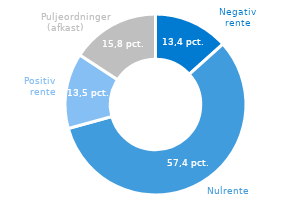
| Category | Series 0 |
|---|---|
| Negativ rente | 13.358 |
| Nul rente | 57.374 |
| Positiv rente | 13.491 |
| Puljeordninger (afkast) | 15.778 |